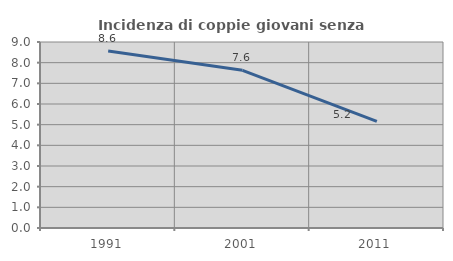
| Category | Incidenza di coppie giovani senza figli |
|---|---|
| 1991.0 | 8.563 |
| 2001.0 | 7.632 |
| 2011.0 | 5.161 |